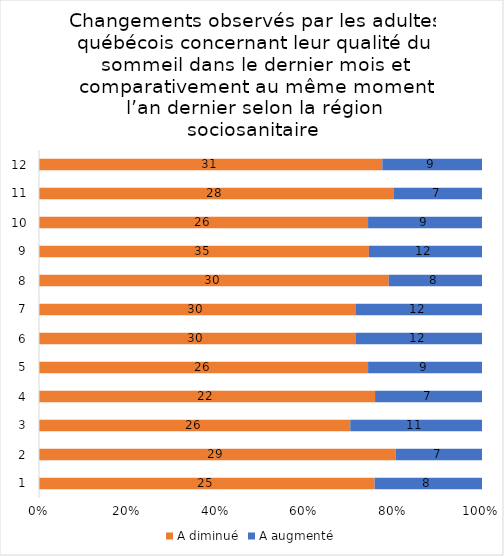
| Category | A diminué | A augmenté |
|---|---|---|
| 0 | 25 | 8 |
| 1 | 29 | 7 |
| 2 | 26 | 11 |
| 3 | 22 | 7 |
| 4 | 26 | 9 |
| 5 | 30 | 12 |
| 6 | 30 | 12 |
| 7 | 30 | 8 |
| 8 | 35 | 12 |
| 9 | 26 | 9 |
| 10 | 28 | 7 |
| 11 | 31 | 9 |